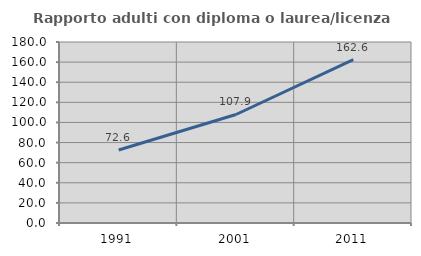
| Category | Rapporto adulti con diploma o laurea/licenza media  |
|---|---|
| 1991.0 | 72.594 |
| 2001.0 | 107.904 |
| 2011.0 | 162.563 |